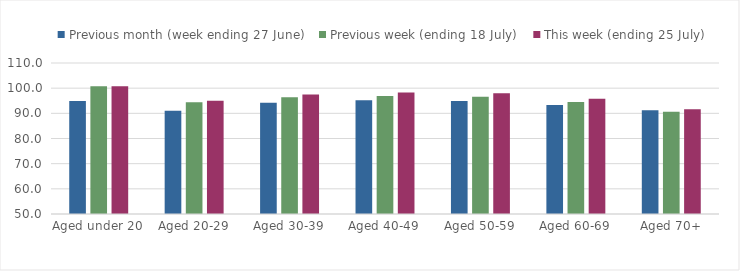
| Category | Previous month (week ending 27 June) | Previous week (ending 18 July) | This week (ending 25 July) |
|---|---|---|---|
| Aged under 20 | 94.9 | 100.794 | 100.714 |
| Aged 20-29 | 91.074 | 94.407 | 95.033 |
| Aged 30-39 | 94.233 | 96.342 | 97.478 |
| Aged 40-49 | 95.176 | 96.852 | 98.292 |
| Aged 50-59 | 94.865 | 96.59 | 97.998 |
| Aged 60-69 | 93.342 | 94.492 | 95.749 |
| Aged 70+ | 91.273 | 90.671 | 91.622 |